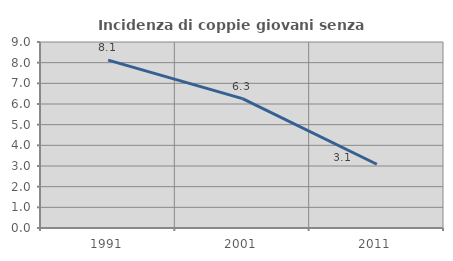
| Category | Incidenza di coppie giovani senza figli |
|---|---|
| 1991.0 | 8.122 |
| 2001.0 | 6.259 |
| 2011.0 | 3.085 |